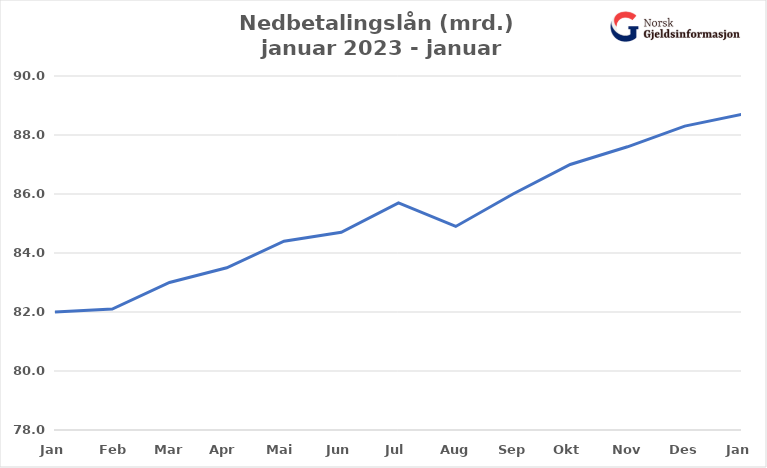
| Category | Nedbetalingslån |
|---|---|
| Jan | 82 |
| Feb | 82.1 |
| Mar | 83 |
| Apr | 83.5 |
| Mai | 84.4 |
| Jun | 84.7 |
| Jul | 85.7 |
| Aug | 84.9 |
| Sep | 86 |
| Okt | 87 |
| Nov | 87.6 |
| Des | 88.3 |
| Jan | 88.7 |